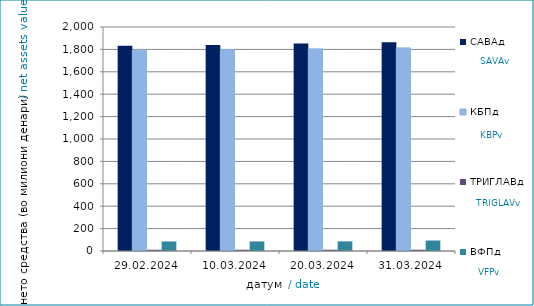
| Category | САВАд | КБПд | ТРИГЛАВд | ВФПд |
|---|---|---|---|---|
| 2024-02-29 | 1832.016 | 1793.351 | 11.163 | 85.038 |
| 2024-03-10 | 1838.477 | 1796.306 | 11.28 | 85.536 |
| 2024-03-20 | 1852.844 | 1804.574 | 11.392 | 86.165 |
| 2024-03-31 | 1863.708 | 1813.559 | 11.439 | 93.46 |